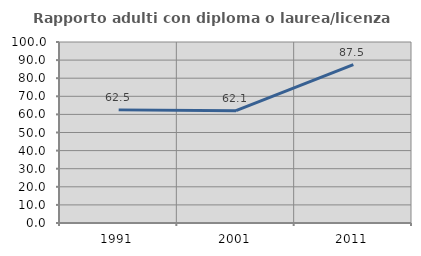
| Category | Rapporto adulti con diploma o laurea/licenza media  |
|---|---|
| 1991.0 | 62.5 |
| 2001.0 | 62.069 |
| 2011.0 | 87.5 |